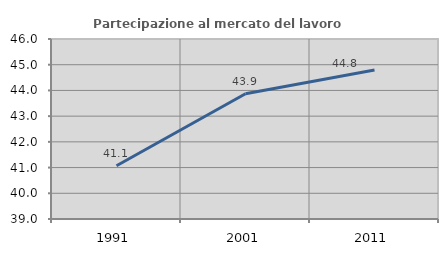
| Category | Partecipazione al mercato del lavoro  femminile |
|---|---|
| 1991.0 | 41.073 |
| 2001.0 | 43.873 |
| 2011.0 | 44.791 |